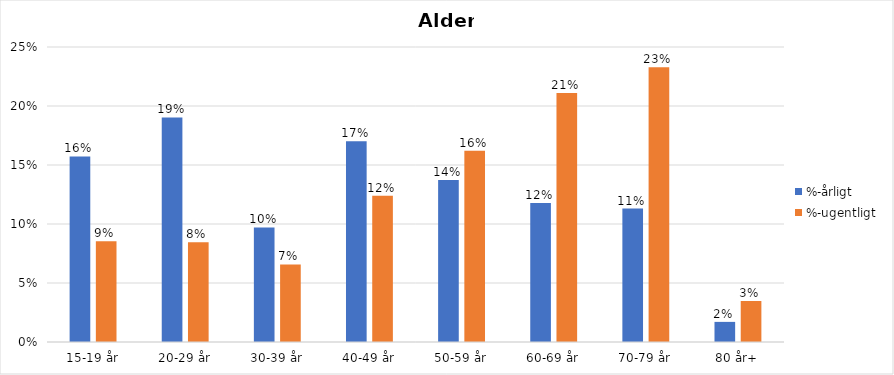
| Category | %-årligt | %-ugentligt |
|---|---|---|
| 15-19 år | 0.157 | 0.085 |
| 20-29 år | 0.19 | 0.085 |
| 30-39 år | 0.097 | 0.066 |
| 40-49 år | 0.17 | 0.124 |
| 50-59 år | 0.137 | 0.162 |
| 60-69 år | 0.118 | 0.211 |
| 70-79 år | 0.113 | 0.233 |
| 80 år+ | 0.017 | 0.035 |